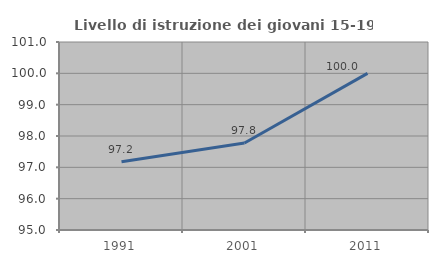
| Category | Livello di istruzione dei giovani 15-19 anni |
|---|---|
| 1991.0 | 97.177 |
| 2001.0 | 97.778 |
| 2011.0 | 100 |